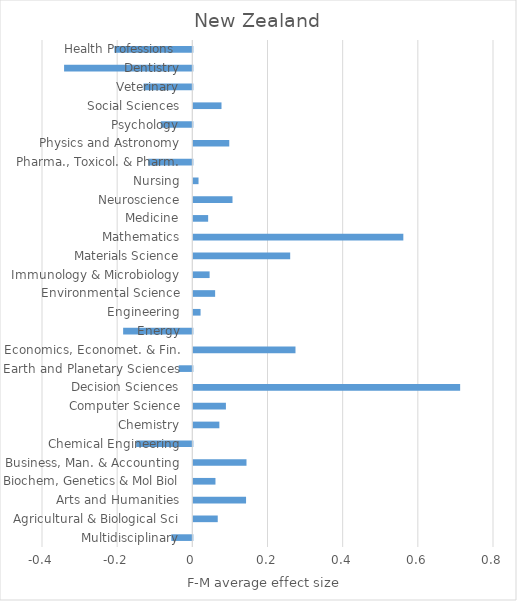
| Category | F-M average effect size |
|---|---|
| Multidisciplinary | -0.056 |
| Agricultural & Biological Sci | 0.065 |
| Arts and Humanities | 0.14 |
| Biochem, Genetics & Mol Biol | 0.059 |
| Business, Man. & Accounting | 0.141 |
| Chemical Engineering | -0.149 |
| Chemistry | 0.069 |
| Computer Science | 0.087 |
| Decision Sciences | 0.71 |
| Earth and Planetary Sciences | -0.036 |
| Economics, Economet. & Fin. | 0.272 |
| Energy | -0.184 |
| Engineering | 0.019 |
| Environmental Science | 0.058 |
| Immunology & Microbiology | 0.043 |
| Materials Science | 0.258 |
| Mathematics | 0.559 |
| Medicine | 0.039 |
| Neuroscience | 0.104 |
| Nursing | 0.014 |
| Pharma., Toxicol. & Pharm. | -0.117 |
| Physics and Astronomy | 0.096 |
| Psychology | -0.084 |
| Social Sciences | 0.075 |
| Veterinary | -0.13 |
| Dentistry | -0.341 |
| Health Professions  | -0.207 |